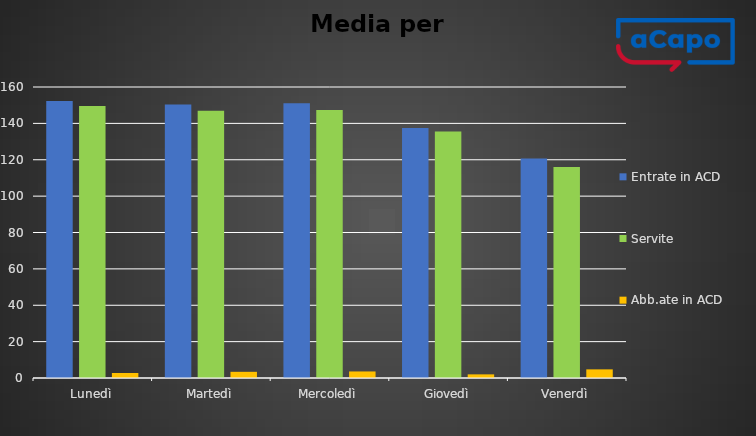
| Category | Entrate in ACD | Servite | Abb.ate in ACD |
|---|---|---|---|
| Lunedì | 152.25 | 149.5 | 2.75 |
| Martedì | 150.4 | 147 | 3.4 |
| Mercoledì | 151 | 147.4 | 3.6 |
| Giovedì | 137.5 | 135.5 | 2 |
| Venerdì | 120.75 | 116 | 4.75 |